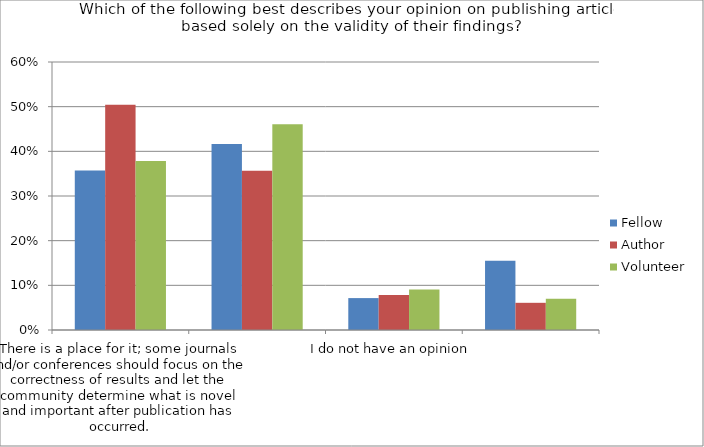
| Category | Fellow | Author | Volunteer |
|---|---|---|---|
| There is a place for it; some journals and/or conferences should focus on the correctness of results and let the community determine what is novel and important after publication has occurred. | 0.357 | 0.504 | 0.379 |
| It is a bad idea for the field; all journals and/or conferences should only publish the most important papers and help authors improve those papers prior to publication. | 0.417 | 0.357 | 0.461 |
| I do not have an opinion | 0.071 | 0.078 | 0.091 |
| I have a different opinion (please specify) | 0.155 | 0.061 | 0.07 |